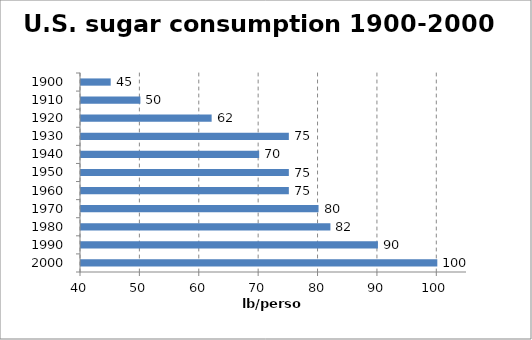
| Category | lb/person |
|---|---|
| 2000.0 | 100 |
| 1990.0 | 90 |
| 1980.0 | 82 |
| 1970.0 | 80 |
| 1960.0 | 75 |
| 1950.0 | 75 |
| 1940.0 | 70 |
| 1930.0 | 75 |
| 1920.0 | 62 |
| 1910.0 | 50 |
| 1900.0 | 45 |